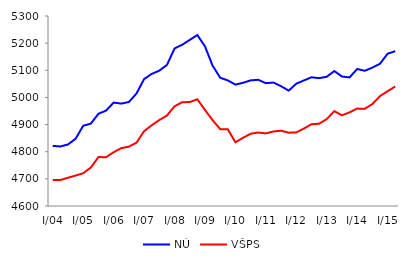
| Category | NÚ | VŠPS |
|---|---|---|
|  I/04 | 4821.442 | 4695.381 |
|  II | 4819.306 | 4695.769 |
|  III | 4826.823 | 4704.18 |
|  IV | 4847.972 | 4712.244 |
|  I/05 | 4895.73 | 4720.772 |
|  II | 4903.454 | 4741.727 |
| III | 4939.901 | 4780.285 |
| IV | 4951.471 | 4779.695 |
|  I/06 | 4981.03 | 4798.378 |
|  II | 4977.295 | 4813.223 |
| III | 4983.046 | 4818.719 |
| IV | 5014.532 | 4833.347 |
|  I/07 | 5067.615 | 4875.732 |
|  II | 5086.677 | 4897.388 |
|  III | 5098.621 | 4916.697 |
|  IV | 5119.659 | 4933.124 |
|  I/08 | 5180.29 | 4967.177 |
|  II | 5194.055 | 4982.498 |
| III | 5211.85 | 4982.865 |
| IV | 5230.124 | 4993.195 |
|  I/09 | 5187.993 | 4953.817 |
|  II | 5117.168 | 4916.333 |
| III | 5072.611 | 4883.176 |
| IV | 5062.629 | 4882.793 |
|  I/10 | 5047.223 | 4834.745 |
| II | 5053.936 | 4851.269 |
| III | 5062.825 | 4866.266 |
| IV | 5064.985 | 4870.657 |
|  I/11 | 5052.544 | 4867.647 |
|  II | 5054.795 | 4874.561 |
|  III | 5041.417 | 4877.321 |
|  IV | 5024.998 | 4870.125 |
|  I/12 | 5050.596 | 4871.031 |
|  II | 5062.626 | 4885.326 |
| III | 5074.232 | 4901.332 |
| IV | 5071.034 | 4903.03 |
|  I/13 | 5076.003 | 4920.131 |
|  II | 5097.207 | 4949.485 |
| III | 5077.084 | 4934.179 |
| IV | 5073.711 | 4944.978 |
|  I/14 | 5104.771 | 4958.882 |
| II | 5098.135 | 4958.177 |
| III | 5109.817 | 4975.627 |
| IV | 5124.054 | 5004.756 |
|  I/15 | 5161.001 | 5022.981 |
| II | 5170.346 | 5040.094 |